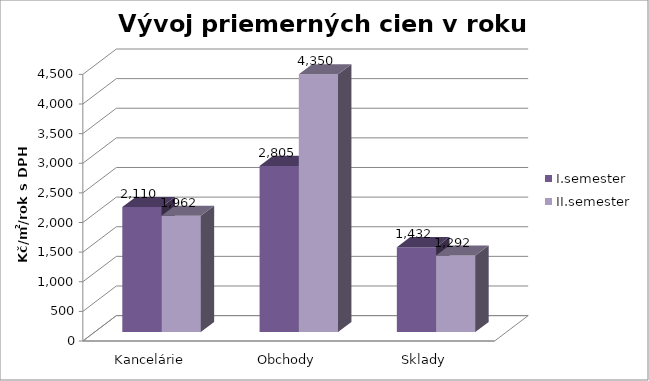
| Category | I.semester | II.semester |
|---|---|---|
| Kancelárie | 2110.104 | 1961.757 |
| Obchody | 2804.52 | 4349.752 |
| Sklady | 1432.254 | 1291.727 |